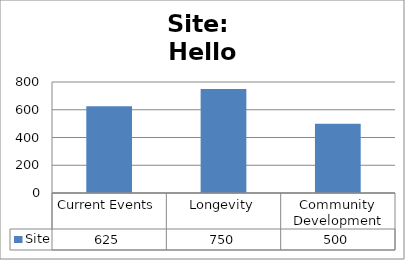
| Category | Site |
|---|---|
| Current Events | 625 |
| Longevity | 750 |
| Community Development | 500 |